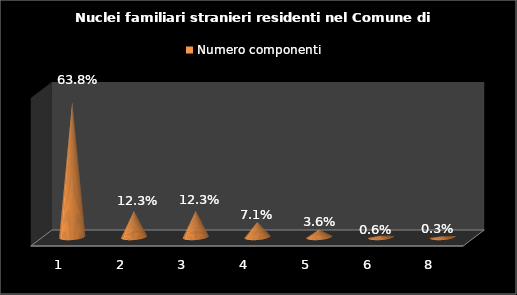
| Category | Numero componenti |
|---|---|
| 1.0 | 0.638 |
| 2.0 | 0.123 |
| 3.0 | 0.123 |
| 4.0 | 0.071 |
| 5.0 | 0.036 |
| 6.0 | 0.006 |
| 8.0 | 0.003 |